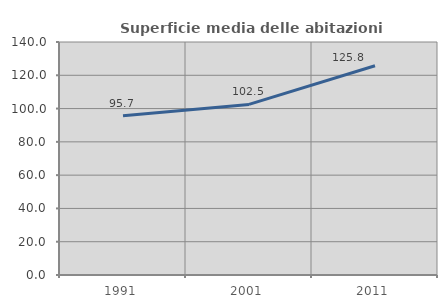
| Category | Superficie media delle abitazioni occupate |
|---|---|
| 1991.0 | 95.658 |
| 2001.0 | 102.502 |
| 2011.0 | 125.753 |